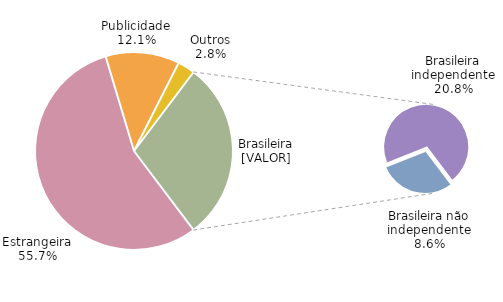
| Category | Series 0 |
|---|---|
| Estrangeira | 0.557 |
| Publicidade | 0.121 |
| Outros | 0.028 |
| Brasileira não independente | 0.086 |
| Brasileira independente | 0.208 |